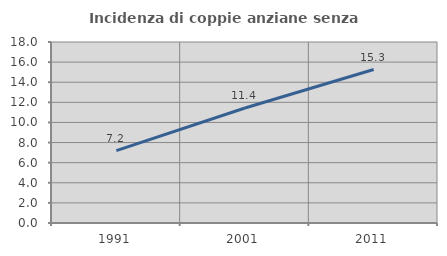
| Category | Incidenza di coppie anziane senza figli  |
|---|---|
| 1991.0 | 7.204 |
| 2001.0 | 11.433 |
| 2011.0 | 15.264 |